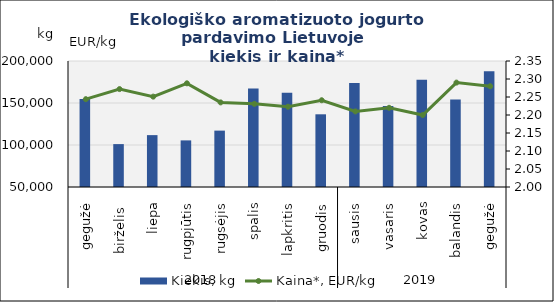
| Category | Kiekis, kg |
|---|---|
| 0 | 154761 |
| 1 | 101067 |
| 2 | 111755 |
| 3 | 105484 |
| 4 | 117121 |
| 5 | 167306 |
| 6 | 162276 |
| 7 | 136547 |
| 8 | 173935 |
| 9 | 146449 |
| 10 | 177766 |
| 11 | 154227 |
| 12 | 187782 |